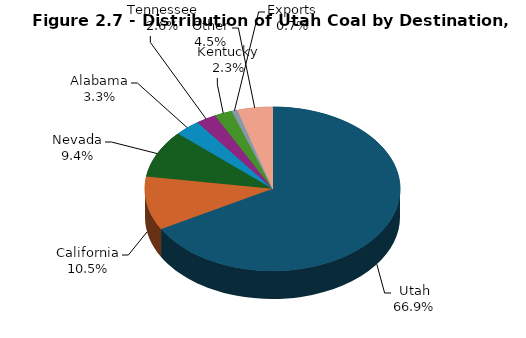
| Category | Series 0 |
|---|---|
| Utah | 13698 |
| California | 2160 |
| Nevada | 1916.8 |
| Alabama | 666 |
| Tennessee | 525 |
| Kentucky | 461 |
| Exports | 148 |
| Other | 914 |